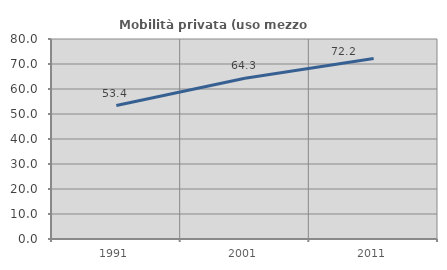
| Category | Mobilità privata (uso mezzo privato) |
|---|---|
| 1991.0 | 53.384 |
| 2001.0 | 64.301 |
| 2011.0 | 72.181 |